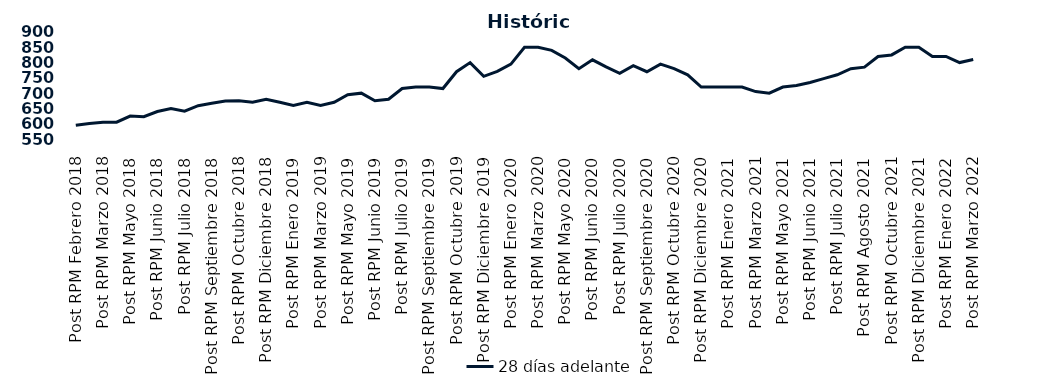
| Category | 28 días adelante |
|---|---|
| Post RPM Febrero 2018 | 595 |
| Pre RPM Marzo 2018 | 601 |
| Post RPM Marzo 2018 | 605 |
| Pre RPM Mayo 2018 | 605 |
| Post RPM Mayo 2018 | 625 |
| Pre RPM Junio 2018 | 623 |
| Post RPM Junio 2018 | 640 |
| Pre RPM Julio 2018 | 650 |
| Post RPM Julio 2018 | 641 |
| Pre RPM Septiembre 2018 | 659 |
| Post RPM Septiembre 2018 | 666.75 |
| Pre RPM Octubre 2018 | 674 |
| Post RPM Octubre 2018 | 675 |
| Pre RPM Diciembre 2018 | 670 |
| Post RPM Diciembre 2018 | 680 |
| Pre RPM Enero 2019 | 670 |
| Post RPM Enero 2019 | 660 |
| Pre RPM Marzo 2019 | 670 |
| Post RPM Marzo 2019 | 660 |
| Pre RPM Mayo 2019 | 670 |
| Post RPM Mayo 2019 | 695 |
| Pre RPM Junio 2019 | 700 |
| Post RPM Junio 2019 | 675 |
| Pre RPM Julio 2019 | 680 |
| Post RPM Julio 2019 | 715 |
| Pre RPM Septiembre 2019 | 720 |
| Post RPM Septiembre 2019 | 720 |
| Pre RPM Octubre 2019 | 715 |
| Post RPM Octubre 2019 | 770 |
| Pre RPM Diciembre 2019 | 800 |
| Post RPM Diciembre 2019 | 755 |
| Pre RPM Enero 2020 | 771 |
| Post RPM Enero 2020 | 795 |
| Pre RPM Marzo 2020 | 850 |
| Post RPM Marzo 2020 | 850 |
| Pre RPM Mayo 2020 | 840 |
| Post RPM Mayo 2020 | 815 |
| Pre RPM Junio 2020 | 780 |
| Post RPM Junio 2020 | 809 |
| Pre RPM Julio 2020 | 785.72 |
| Post RPM Julio 2020 | 765 |
| Pre RPM Septiembre 2020 | 790 |
| Post RPM Septiembre 2020 | 770 |
| Pre RPM Octubre 2020 | 795 |
| Post RPM Octubre 2020 | 780 |
| Pre RPM Diciembre 2020 | 760 |
| Post RPM Diciembre 2020 | 720 |
| Pre RPM Enero 2021 | 720 |
| Post RPM Enero 2021 | 720 |
| Pre RPM Marzo 2021 | 720 |
| Post RPM Marzo 2021 | 705 |
| Pre RPM Mayo 2021 | 700 |
| Post RPM Mayo 2021 | 720 |
| Pre RPM Junio 2021 | 725 |
| Post RPM Junio 2021 | 735 |
| Pre RPM Julio 2021 | 747.5 |
| Post RPM Julio 2021 | 760 |
| Pre RPM Agosto 2021 | 780 |
| Post RPM Agosto 2021 | 785 |
| Pre RPM Octubre 2021 | 820 |
| Post RPM Octubre 2021 | 825 |
| Pre RPM Diciembre 2021 | 850 |
| Post RPM Diciembre 2021 | 850 |
| Pre RPM Enero 2022 | 820 |
| Post RPM Enero 2022 | 820 |
| Pre RPM Marzo 2022 | 800 |
| Post RPM Marzo 2022 | 810 |